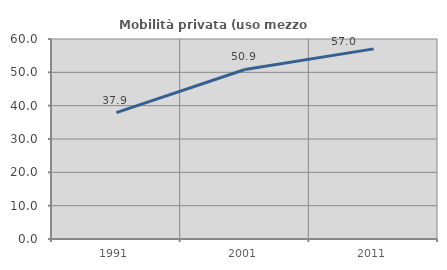
| Category | Mobilità privata (uso mezzo privato) |
|---|---|
| 1991.0 | 37.921 |
| 2001.0 | 50.852 |
| 2011.0 | 57.038 |